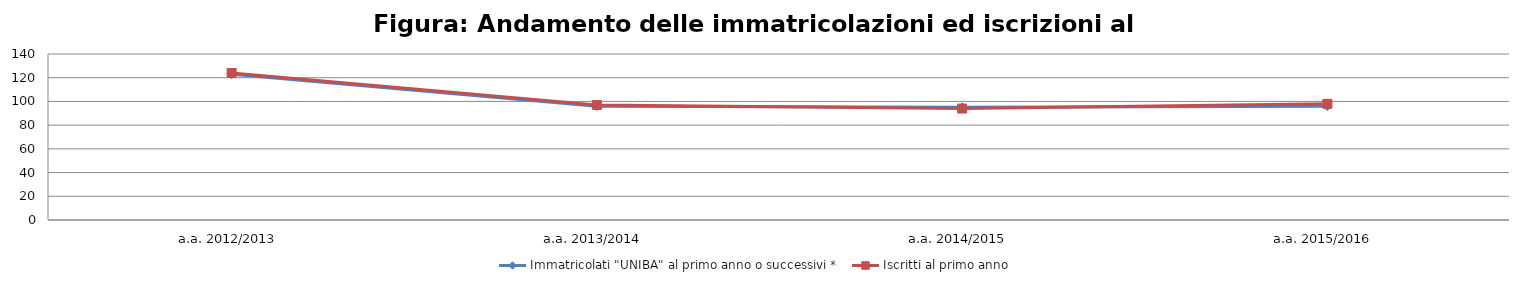
| Category | Immatricolati "UNIBA" al primo anno o successivi * | Iscritti al primo anno  |
|---|---|---|
| a.a. 2012/2013 | 123 | 124 |
| a.a. 2013/2014 | 96 | 97 |
| a.a. 2014/2015 | 95 | 94 |
| a.a. 2015/2016 | 96 | 98 |